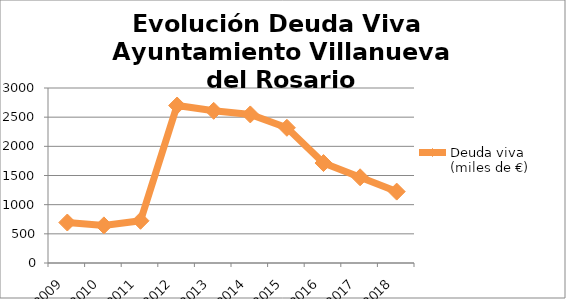
| Category | Deuda viva (miles de €) |
|---|---|
| 2009.0 | 694 |
| 2010.0 | 645 |
| 2011.0 | 724 |
| 2012.0 | 2700 |
| 2013.0 | 2609 |
| 2014.0 | 2547 |
| 2015.0 | 2318 |
| 2016.0 | 1714 |
| 2017.0 | 1469 |
| 2018.0 | 1224 |